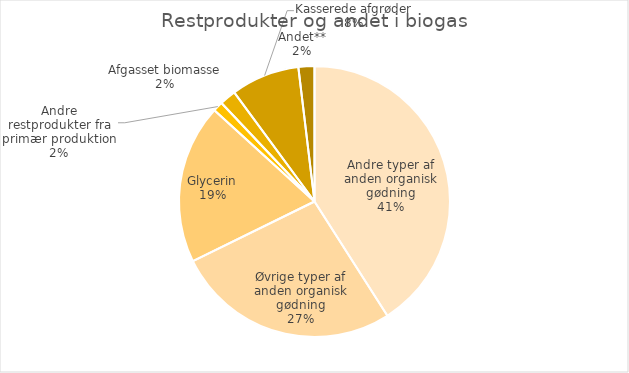
| Category | Series 0 |
|---|---|
| Andre typer af anden organisk gødning | 156337.34 |
| Øvrige typer af anden organisk gødning | 102187.59 |
| Glycerin | 72598.91 |
| Andre restprodukter fra primær produktion | 4555.6 |
| Afgasset biomasse | 7468 |
| Kasserede afgrøder | 31235.2 |
| Andet** | 7283 |